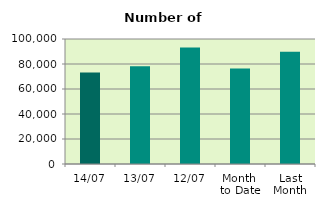
| Category | Series 0 |
|---|---|
| 14/07 | 73136 |
| 13/07 | 78218 |
| 12/07 | 93128 |
| Month 
to Date | 76307.4 |
| Last
Month | 89884.909 |